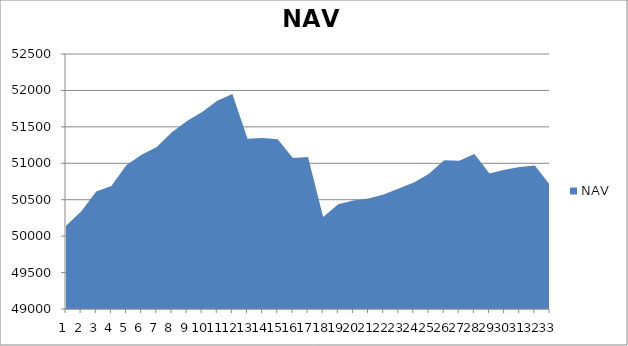
| Category | NAV |
|---|---|
| 0 | 50142.343 |
| 1 | 50336.57 |
| 2 | 50612.255 |
| 3 | 50687.913 |
| 4 | 50975.413 |
| 5 | 51115.874 |
| 6 | 51223.542 |
| 7 | 51427.364 |
| 8 | 51580.567 |
| 9 | 51704.692 |
| 10 | 51858.016 |
| 11 | 51951.766 |
| 12 | 51336.067 |
| 13 | 51345.356 |
| 14 | 51328.667 |
| 15 | 51072.985 |
| 16 | 51085.199 |
| 17 | 50261.67 |
| 18 | 50438.394 |
| 19 | 50489.896 |
| 20 | 50518.251 |
| 21 | 50572.468 |
| 22 | 50655.55 |
| 23 | 50737.787 |
| 24 | 50856.035 |
| 25 | 51041.806 |
| 26 | 51034.925 |
| 27 | 51128.589 |
| 28 | 50859.456 |
| 29 | 50911.137 |
| 30 | 50950.007 |
| 31 | 50970.175 |
| 32 | 50701.326 |